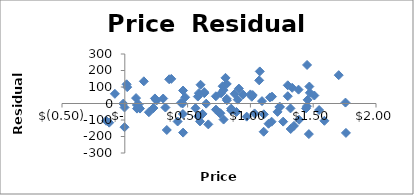
| Category | Series 0 |
|---|---|
| 1.0 | 55.105 |
| 1.07475 | 194.395 |
| 1.3210000000000002 | -154.579 |
| 1.5470000000000002 | -39.675 |
| 1.38325 | 83.977 |
| 1.1720000000000002 | 41.561 |
| 1.3870000000000002 | -98.526 |
| 1.2302500000000003 | -21.192 |
| 1.1067500000000003 | -65.416 |
| 1.23625 | -20.591 |
| 1.4735000000000003 | 64.778 |
| 1.4432500000000004 | -29.43 |
| 1.2977500000000004 | 44.289 |
| 1.2160000000000004 | -50.67 |
| 1.4510000000000005 | 233.565 |
| 1.2972500000000005 | 110.369 |
| 1.2607500000000005 | -109.848 |
| 1.3325 | 95.19 |
| 1.1442500000000004 | -122.677 |
| 1.3192500000000005 | -29.747 |
| 1.1057500000000005 | -171.073 |
| 0.9705000000000005 | -79.726 |
| 1.16875 | -110.271 |
| 0.9417500000000004 | 54.315 |
| 1.0925 | 14.426 |
| 0.8992500000000004 | 23.229 |
| 0.7855000000000004 | 80.87 |
| 0.7615000000000004 | -59.048 |
| 0.665 | -126.587 |
| 0.8117500000000004 | 118.469 |
| 0.875 | 58.811 |
| 0.7790000000000005 | 104.686 |
| 0.6030000000000004 | 113.575 |
| 0.4642500000000004 | -176.455 |
| 0.46375 | 78.644 |
| 0.59875 | -108.453 |
| 0.5842500000000004 | -77.578 |
| 0.8127500000000004 | 19.421 |
| 0.8120000000000004 | 28.225 |
| 0.725 | 43.808 |
| 0.48075000000000045 | 37.723 |
| 0.7255000000000005 | -37.036 |
| 0.8477500000000004 | -41.627 |
| 0.7545000000000004 | -58.211 |
| 0.5815000000000003 | 41.957 |
| 0.6325 | 69.218 |
| 0.8472500000000004 | -30.872 |
| 1.0110000000000003 | 40.828 |
| 0.88875 | -51.315 |
| 1.0185000000000004 | 51.317 |
| 1.0332500000000004 | -60.248 |
| 0.7865000000000004 | -97.284 |
| 0.5897500000000004 | 62.776 |
| 0.46050000000000046 | 0.099 |
| 0.30575000000000047 | 30.112 |
| 0.11 | -5.355 |
| 0.23975000000000046 | 30.671 |
| 0.09725000000000047 | -31 |
| 0.2527500000000005 | 17.972 |
| 0.09625000000000047 | -8.813 |
| 0.08975000000000047 | 32.876 |
| -0.00224999999999953 | -24.026 |
| -0.07899999999999953 | 58.675 |
| 0.12125 | -30.706 |
| -0.012249999999999525 | -0.69 |
| 0.22800000000000048 | -27.746 |
| 0.4475 | 3.983 |
| 0.32350000000000045 | -24.245 |
| 0.19175000000000045 | -52.932 |
| -0.002249999999999558 | -143.573 |
| -0.12424999999999956 | -116.131 |
| 0.014500000000000457 | 116.337 |
| -0.14824999999999955 | -104.78 |
| 0.01925000000000046 | 99.324 |
| 0.15150000000000047 | 134.425 |
| 0.37025000000000047 | 149.334 |
| 0.4205000000000005 | -109.06 |
| 0.3342500000000005 | -160.566 |
| 0.4627500000000005 | -63.546 |
| 0.3535000000000005 | 146.773 |
| 0.5630000000000005 | -28.706 |
| 0.6192500000000005 | -63.325 |
| 0.8017500000000005 | 155.554 |
| 0.6480000000000006 | -1.04 |
| 0.7660000000000006 | 62.12 |
| 0.6330000000000006 | 62.462 |
| 0.8497500000000006 | -39.324 |
| 0.9082500000000006 | 90.447 |
| 1.07 | 140.318 |
| 1.1557500000000005 | 36.84 |
| 1.3467500000000006 | -135.789 |
| 1.4655000000000005 | -185.418 |
| 1.4555000000000005 | 22.14 |
| 1.45 | -16.307 |
| 1.4692500000000004 | 102.799 |
| 1.7032500000000004 | 171.75 |
| 1.7570000000000003 | 5.54 |
| 1.5090000000000003 | 48.332 |
| 1.7605000000000004 | -178.292 |
| 1.5892500000000003 | -104.901 |